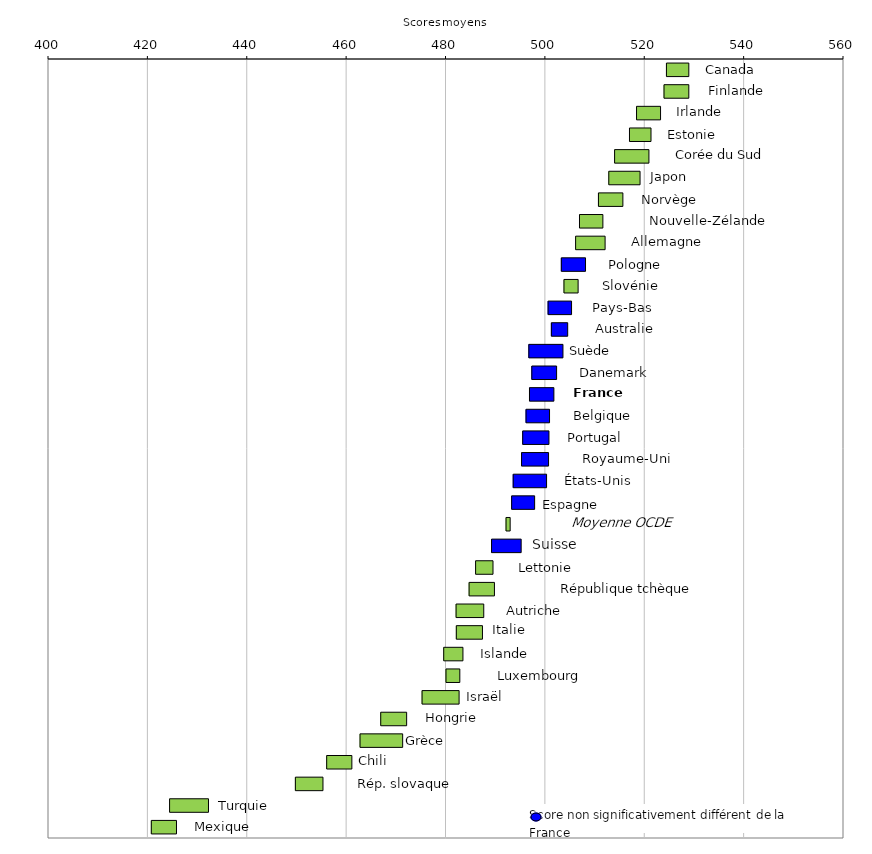
| Category | Series 0 | Series 1 | Series 2 |
|---|---|---|---|
| Canada | 524.367 | 4.602 |  |
| Finlande | 523.878 | 5.093 |  |
| Irlande | 518.349 | 4.932 |  |
| Estonie | 516.925 | 4.435 |  |
| Corée du Sud | 513.932 | 7.009 |  |
| Japon | 512.761 | 6.394 |  |
| Norvège | 510.682 | 5.019 |  |
| Nouvelle-Zélande | 506.866 | 4.809 |  |
| Allemagne | 506.086 | 6.037 |  |
| Pologne | 503.212 | 4.97 |  |
| Slovénie | 503.743 | 2.946 |  |
| Pays-Bas | 500.547 | 4.823 |  |
| Australie | 501.21 | 3.382 |  |
| Suède | 496.672 | 6.967 |  |
| Danemark | 497.27 | 5.089 |  |
| France | 496.799 | 5.014 |  |
| Belgique | 496.108 | 4.831 |  |
| Portugal | 495.435 | 5.387 |  |
| Royaume-Uni | 495.203 | 5.539 |  |
| États-Unis | 493.528 | 6.815 |  |
| Espagne | 493.213 | 4.728 |  |
| Moyenne OCDE | 492.085 | 0.928 |  |
| Suisse | 489.167 | 6.062 |  |
| Lettonie | 485.956 | 3.604 |  |
| Rép. tchèque | 484.65 | 5.199 |  |
| Autriche | 482.03 | 5.671 |  |
| Italie | 482.077 | 5.363 |  |
| Islande | 479.541 | 3.97 |  |
| Luxembourg | 479.998 | 2.883 |  |
| Israël | 475.184 | 7.553 |  |
| Hongrie | 466.864 | 5.318 |  |
| Grèce | 462.701 | 8.677 |  |
| Chili | 455.986 | 5.17 |  |
| Rép. slovaque | 449.686 | 5.656 |  |
| Turquie | 424.371 | 7.928 |  |
| Mexique | 420.693 | 5.167 |  |